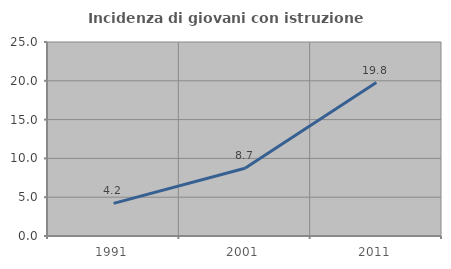
| Category | Incidenza di giovani con istruzione universitaria |
|---|---|
| 1991.0 | 4.202 |
| 2001.0 | 8.73 |
| 2011.0 | 19.78 |